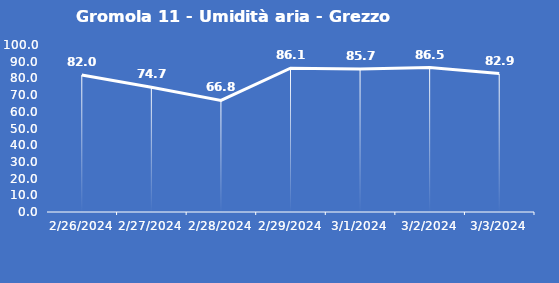
| Category | Gromola 11 - Umidità aria - Grezzo (%) |
|---|---|
| 2/26/24 | 82 |
| 2/27/24 | 74.7 |
| 2/28/24 | 66.8 |
| 2/29/24 | 86.1 |
| 3/1/24 | 85.7 |
| 3/2/24 | 86.5 |
| 3/3/24 | 82.9 |